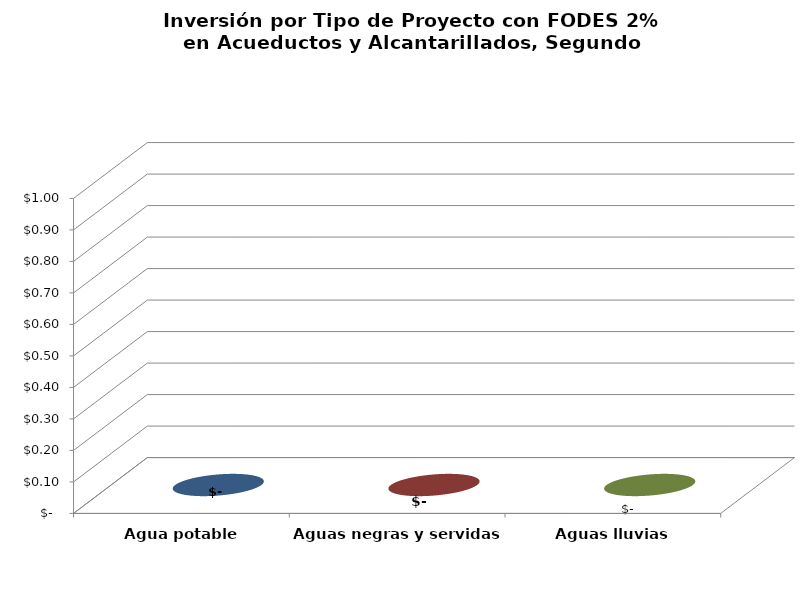
| Category | Series 0 |
|---|---|
| Agua potable | 0 |
| Aguas negras y servidas | 0 |
| Aguas lluvias | 0 |